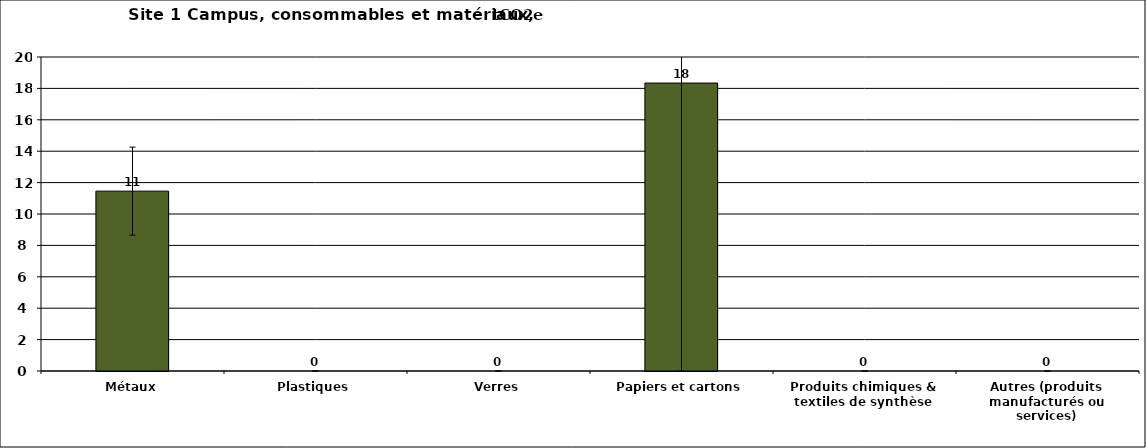
| Category | Series 0 |
|---|---|
| Métaux | 11.457 |
| Plastiques | 0 |
| Verres | 0 |
| Papiers et cartons | 18.342 |
| Produits chimiques & textiles de synthèse | 0 |
| Autres (produits manufacturés ou services) | 0 |